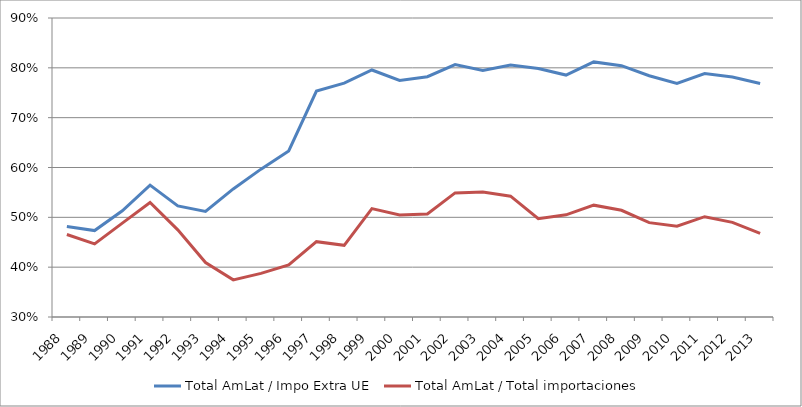
| Category | Total AmLat / Impo Extra UE | Total AmLat / Total importaciones |
|---|---|---|
| 1988.0 | 0.482 | 0.465 |
| 1989.0 | 0.473 | 0.447 |
| 1990.0 | 0.513 | 0.488 |
| 1991.0 | 0.565 | 0.53 |
| 1992.0 | 0.523 | 0.475 |
| 1993.0 | 0.512 | 0.409 |
| 1994.0 | 0.557 | 0.374 |
| 1995.0 | 0.597 | 0.388 |
| 1996.0 | 0.633 | 0.405 |
| 1997.0 | 0.753 | 0.451 |
| 1998.0 | 0.769 | 0.444 |
| 1999.0 | 0.796 | 0.517 |
| 2000.0 | 0.775 | 0.505 |
| 2001.0 | 0.782 | 0.507 |
| 2002.0 | 0.807 | 0.549 |
| 2003.0 | 0.795 | 0.551 |
| 2004.0 | 0.806 | 0.543 |
| 2005.0 | 0.799 | 0.497 |
| 2006.0 | 0.785 | 0.505 |
| 2007.0 | 0.812 | 0.524 |
| 2008.0 | 0.804 | 0.514 |
| 2009.0 | 0.784 | 0.489 |
| 2010.0 | 0.769 | 0.482 |
| 2011.0 | 0.788 | 0.501 |
| 2012.0 | 0.782 | 0.49 |
| 2013.0 | 0.769 | 0.468 |